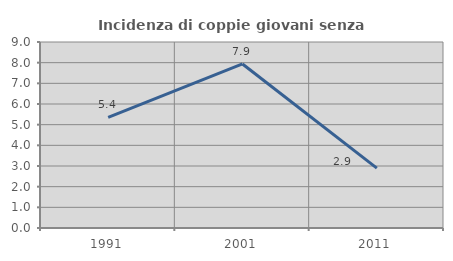
| Category | Incidenza di coppie giovani senza figli |
|---|---|
| 1991.0 | 5.357 |
| 2001.0 | 7.937 |
| 2011.0 | 2.899 |